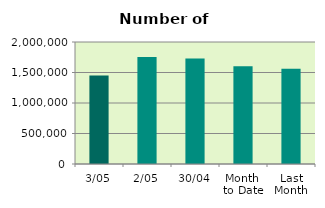
| Category | Series 0 |
|---|---|
| 3/05 | 1450036 |
| 2/05 | 1754742 |
| 30/04 | 1730970 |
| Month 
to Date | 1602389 |
| Last
Month | 1561575.6 |